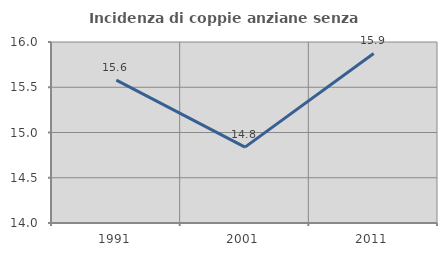
| Category | Incidenza di coppie anziane senza figli  |
|---|---|
| 1991.0 | 15.578 |
| 2001.0 | 14.839 |
| 2011.0 | 15.873 |